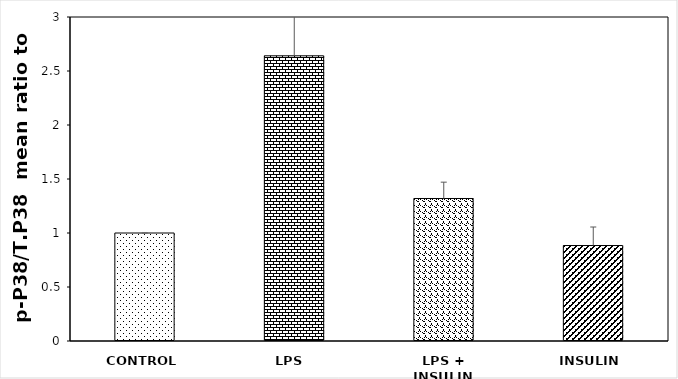
| Category | Series 0 |
|---|---|
| CONTROL | 1 |
| LPS  | 2.641 |
| LPS + INSULIN | 1.319 |
| INSULIN | 0.884 |